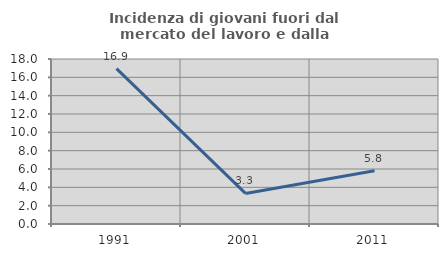
| Category | Incidenza di giovani fuori dal mercato del lavoro e dalla formazione  |
|---|---|
| 1991.0 | 16.949 |
| 2001.0 | 3.333 |
| 2011.0 | 5.814 |